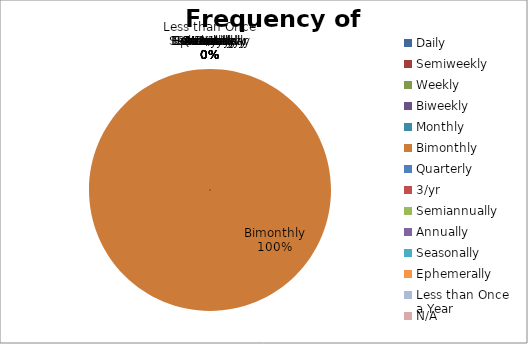
| Category | Frequency of Monitoring |
|---|---|
| Daily | 0 |
| Semiweekly | 0 |
| Weekly | 0 |
| Biweekly | 0 |
| Monthly | 0 |
| Bimonthly | 1 |
| Quarterly | 0 |
| 3/yr | 0 |
| Semiannually | 0 |
| Annually | 0 |
| Seasonally | 0 |
| Ephemerally | 0 |
| Less than Once a Year | 0 |
| N/A | 0 |
| Not this Year | 0 |